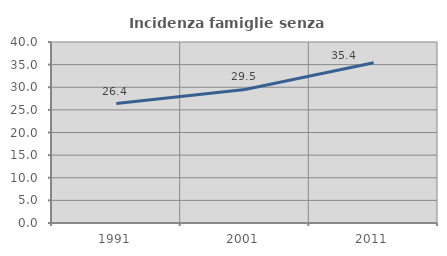
| Category | Incidenza famiglie senza nuclei |
|---|---|
| 1991.0 | 26.401 |
| 2001.0 | 29.504 |
| 2011.0 | 35.411 |